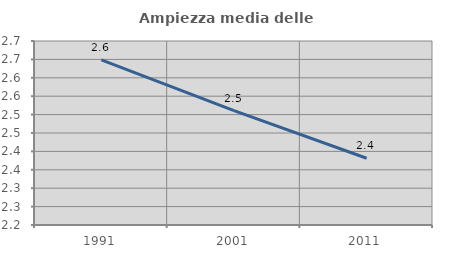
| Category | Ampiezza media delle famiglie |
|---|---|
| 1991.0 | 2.649 |
| 2001.0 | 2.511 |
| 2011.0 | 2.381 |